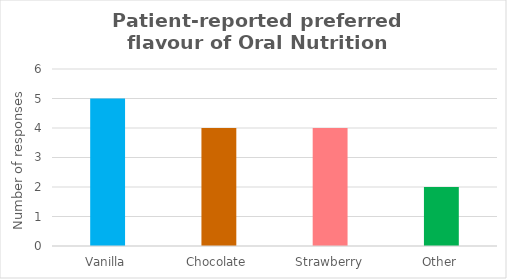
| Category | Series 0 |
|---|---|
| Vanilla | 5 |
| Chocolate | 4 |
| Strawberry | 4 |
| Other | 2 |